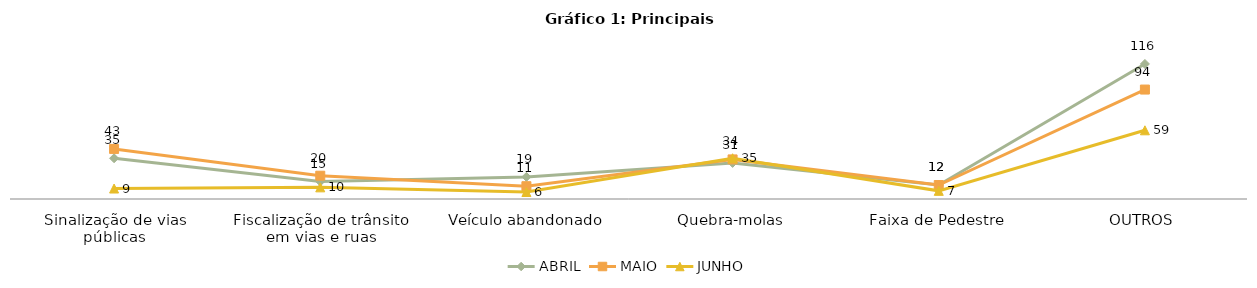
| Category | ABRIL | MAIO | JUNHO |
|---|---|---|---|
| Sinalização de vias públicas | 35 | 43 | 9 |
| Fiscalização de trânsito em vias e ruas | 15 | 20 | 10 |
| Veículo abandonado | 19 | 11 | 6 |
| Quebra-molas | 31 | 34 | 35 |
| Faixa de Pedestre | 12 | 12 | 7 |
| OUTROS | 116 | 94 | 59 |